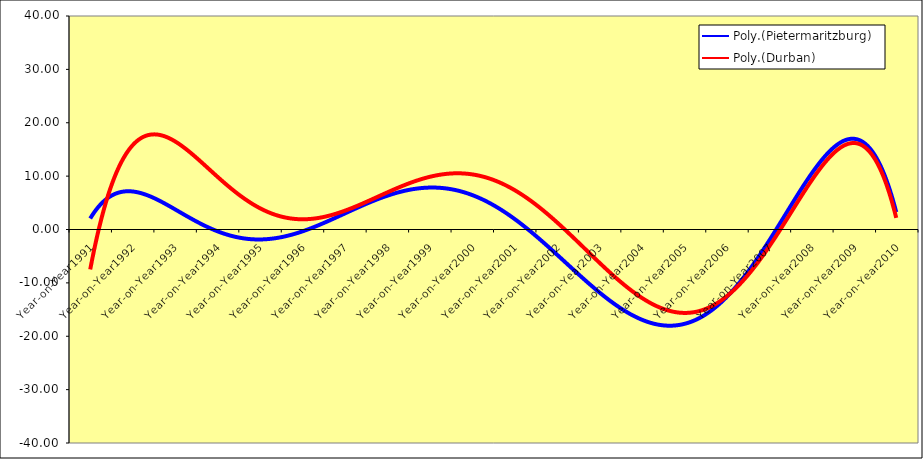
| Category | Pietermaritzburg | Durban |
|---|---|---|
| Year-on-Year1991 | 2.239 | -6.628 |
| Year-on-Year1992 | 5.869 | 8.596 |
| Year-on-Year1993 | 5.009 | 33.306 |
| Year-on-Year1994 | 0.521 | 0.362 |
| Year-on-Year1995 | -3.004 | -0.96 |
| Year-on-Year1996 | 3.49 | -10.367 |
| Year-on-Year1997 | 2.482 | 29.41 |
| Year-on-Year1998 | -8.601 | 6.445 |
| Year-on-Year1999 | 15.905 | 8.902 |
| Year-on-Year2000 | 5.48 | -4.268 |
| Year-on-Year2001 | 22.621 | -3.257 |
| Year-on-Year2002 | -9.94 | 21.643 |
| Year-on-Year2003 | -23.937 | -3.002 |
| Year-on-Year2004 | -35.923 | -7.906 |
| Year-on-Year2005 | 3.985 | -36.232 |
| Year-on-Year2006 | -9.935 | -10.284 |
| Year-on-Year2007 | -3.73 | 10.82 |
| Year-on-Year2008 | 10.7 | 1.391 |
| Year-on-Year2009 | 12.103 | 16.748 |
| Year-on-Year2010 | 5.28 | 2.088 |